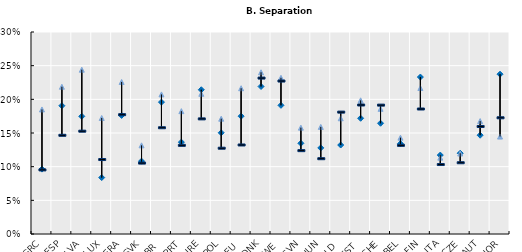
| Category | 2001-2007 | 2008-2012 | 2016-2018 |
|---|---|---|---|
| GRC | 0.096 | 0.185 | 0.095 |
| ESP | 0.191 | 0.219 | 0.147 |
| LVA | 0.175 | 0.244 | 0.153 |
| LUX | 0.084 | 0.172 | 0.111 |
| FRA | 0.176 | 0.226 | 0.177 |
| SVK | 0.108 | 0.132 | 0.105 |
| GBR | 0.196 | 0.207 | 0.158 |
| PRT | 0.136 | 0.182 | 0.132 |
| IRE | 0.214 | 0.208 | 0.171 |
| POL | 0.15 | 0.171 | 0.127 |
| DEU | 0.175 | 0.216 | 0.132 |
| DNK | 0.219 | 0.24 | 0.232 |
| SWE | 0.191 | 0.232 | 0.227 |
| SVN | 0.135 | 0.158 | 0.124 |
| HUN | 0.128 | 0.159 | 0.112 |
| NLD | 0.132 | 0.172 | 0.181 |
| EST | 0.172 | 0.198 | 0.192 |
| CHE | 0.164 | 0.186 | 0.191 |
| BEL | 0.134 | 0.143 | 0.132 |
| FIN | 0.233 | 0.217 | 0.186 |
| ITA | 0.117 | 0.113 | 0.103 |
| CZE | 0.12 | 0.12 | 0.106 |
| AUT | 0.147 | 0.168 | 0.16 |
| NOR | 0.237 | 0.145 | 0.173 |